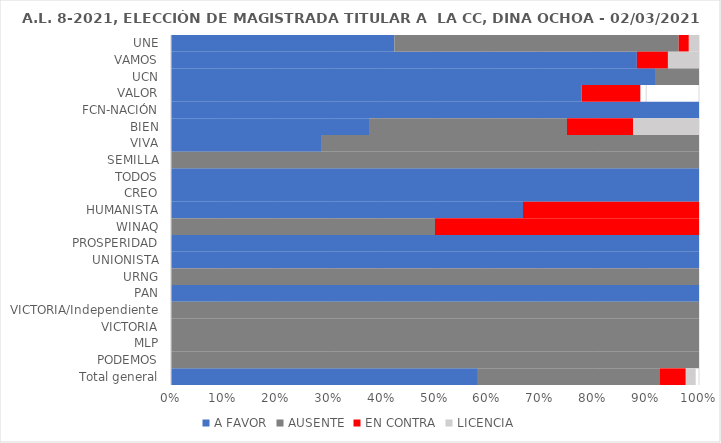
| Category | A FAVOR | AUSENTE | EN CONTRA | LICENCIA |
|---|---|---|---|---|
| UNE | 0.423 | 0.538 | 0.019 | 0.019 |
| VAMOS | 0.882 | 0 | 0.059 | 0.059 |
| UCN | 0.917 | 0.083 | 0 | 0 |
| VALOR | 0.778 | 0 | 0.111 | 0 |
| FCN-NACIÓN | 1 | 0 | 0 | 0 |
| BIEN | 0.375 | 0.375 | 0.125 | 0.125 |
| VIVA | 0.286 | 0.714 | 0 | 0 |
| SEMILLA | 0 | 1 | 0 | 0 |
| TODOS | 1 | 0 | 0 | 0 |
| CREO | 1 | 0 | 0 | 0 |
| HUMANISTA | 0.667 | 0 | 0.333 | 0 |
| WINAQ | 0 | 0.5 | 0.5 | 0 |
| PROSPERIDAD | 1 | 0 | 0 | 0 |
| UNIONISTA | 1 | 0 | 0 | 0 |
| URNG | 0 | 1 | 0 | 0 |
| PAN | 1 | 0 | 0 | 0 |
| VICTORIA/Independiente | 0 | 1 | 0 | 0 |
| VICTORIA | 0 | 1 | 0 | 0 |
| MLP | 0 | 1 | 0 | 0 |
| PODEMOS | 0 | 1 | 0 | 0 |
| Total general | 0.581 | 0.344 | 0.05 | 0.019 |